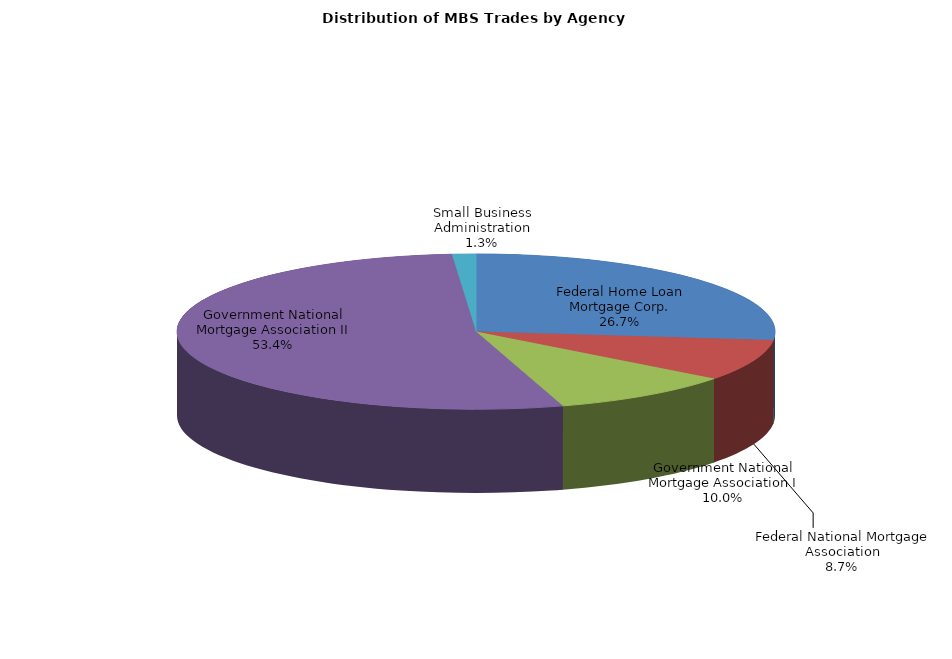
| Category | Series 0 |
|---|---|
| Federal Home Loan Mortgage Corp. | 386.056 |
| Federal National Mortgage Association | 125.143 |
| Government National Mortgage Association I | 144.036 |
| Government National Mortgage Association II | 772.071 |
| Small Business Administration | 18.567 |